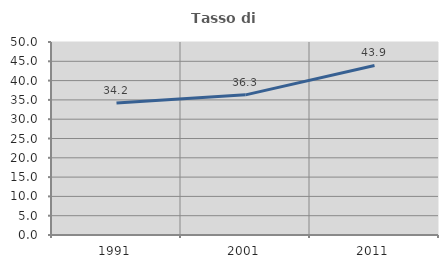
| Category | Tasso di occupazione   |
|---|---|
| 1991.0 | 34.206 |
| 2001.0 | 36.306 |
| 2011.0 | 43.93 |